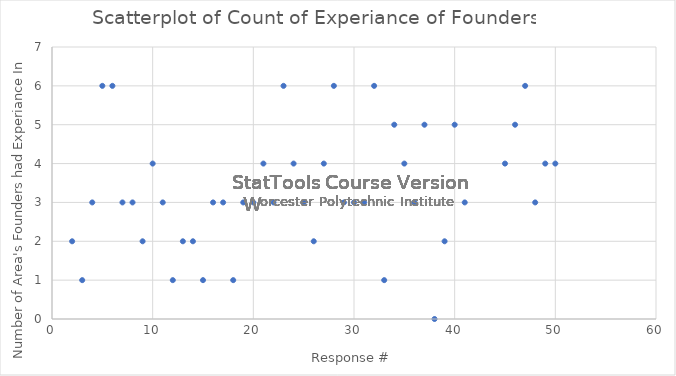
| Category | Series 0 |
|---|---|
| 2.0 | 2 |
| 3.0 | 1 |
| 4.0 | 3 |
| 5.0 | 6 |
| 6.0 | 6 |
| 7.0 | 3 |
| 8.0 | 3 |
| 9.0 | 2 |
| 10.0 | 4 |
| 11.0 | 3 |
| 12.0 | 1 |
| 13.0 | 2 |
| 14.0 | 2 |
| 15.0 | 1 |
| 16.0 | 3 |
| 17.0 | 3 |
| 18.0 | 1 |
| 19.0 | 3 |
| 20.0 | 3 |
| 21.0 | 4 |
| 22.0 | 3 |
| 23.0 | 6 |
| 24.0 | 4 |
| 25.0 | 3 |
| 26.0 | 2 |
| 27.0 | 4 |
| 28.0 | 6 |
| 29.0 | 3 |
| 30.0 | 3 |
| 31.0 | 3 |
| 32.0 | 6 |
| 33.0 | 1 |
| 34.0 | 5 |
| 35.0 | 4 |
| 36.0 | 3 |
| 37.0 | 5 |
| 38.0 | 0 |
| 39.0 | 2 |
| 40.0 | 5 |
| 41.0 | 3 |
| 45.0 | 4 |
| 46.0 | 5 |
| 47.0 | 6 |
| 48.0 | 3 |
| 49.0 | 4 |
| 50.0 | 4 |